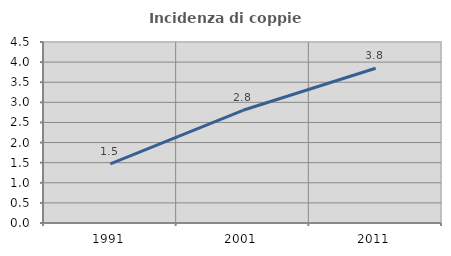
| Category | Incidenza di coppie miste |
|---|---|
| 1991.0 | 1.471 |
| 2001.0 | 2.802 |
| 2011.0 | 3.846 |